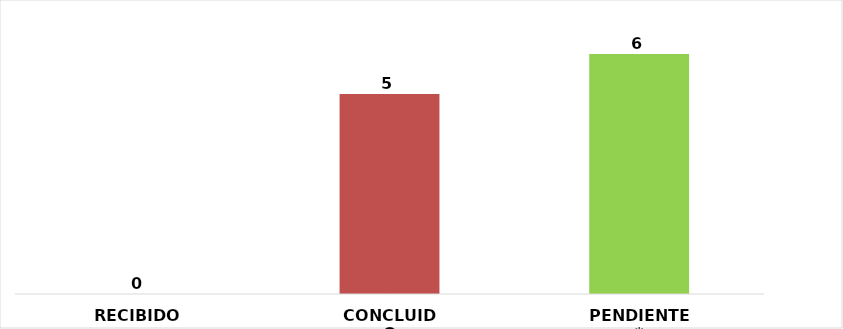
| Category | RECIBIDO |
|---|---|
| RECIBIDO | 0 |
| CONCLUIDO | 5 |
| PENDIENTE* | 6 |